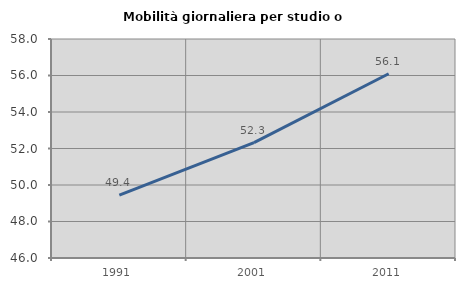
| Category | Mobilità giornaliera per studio o lavoro |
|---|---|
| 1991.0 | 49.442 |
| 2001.0 | 52.323 |
| 2011.0 | 56.098 |